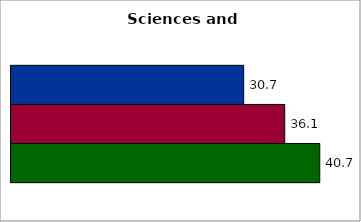
| Category | 50 states and D.C. | SREB states | State |
|---|---|---|---|
| 0 | 30.703 | 36.123 | 40.747 |